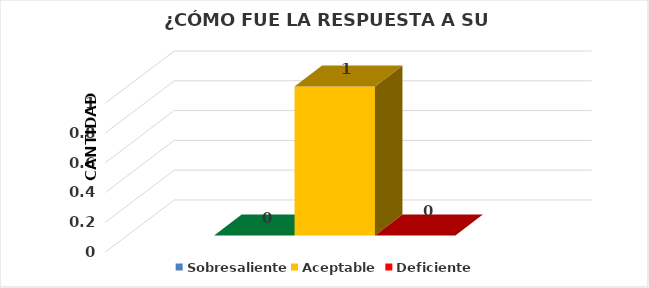
| Category | Sobresaliente | Aceptable  | Deficiente |
|---|---|---|---|
| 0 | 0 | 1 | 0 |